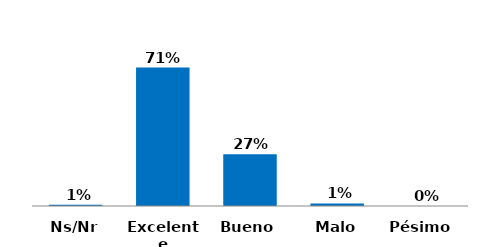
| Category | Series 0 |
|---|---|
| Pésimo  | 0 |
| Malo | 0.013 |
| Bueno | 0.267 |
| Excelente | 0.713 |
| Ns/Nr | 0.007 |